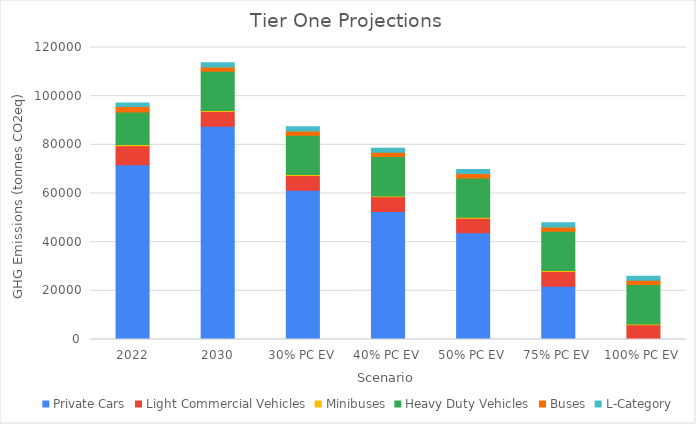
| Category | Private Cars | Light Commercial Vehicles | Minibuses | Heavy Duty Vehicles | Buses | L-Category |
|---|---|---|---|---|---|---|
| 2022 | 71848.232 | 7803.703 | 466.793 | 13421.947 | 2188.11 | 1418.797 |
| 2030 | 87673.762 | 6026.904 | 365.865 | 16178.429 | 1769.222 | 1682.307 |
| 30% PC EV | 61371.634 | 6026.904 | 365.865 | 16178.429 | 1769.222 | 1682.307 |
| 40% PC EV | 52604.257 | 6026.904 | 365.865 | 16178.429 | 1769.222 | 1682.307 |
| 50% PC EV | 43836.881 | 6026.904 | 365.865 | 16178.429 | 1769.222 | 1682.307 |
| 75% PC EV | 21918.441 | 6026.904 | 365.865 | 16178.429 | 1769.222 | 1682.307 |
| 100% PC EV | 0 | 6026.904 | 365.865 | 16178.429 | 1769.222 | 1682.307 |